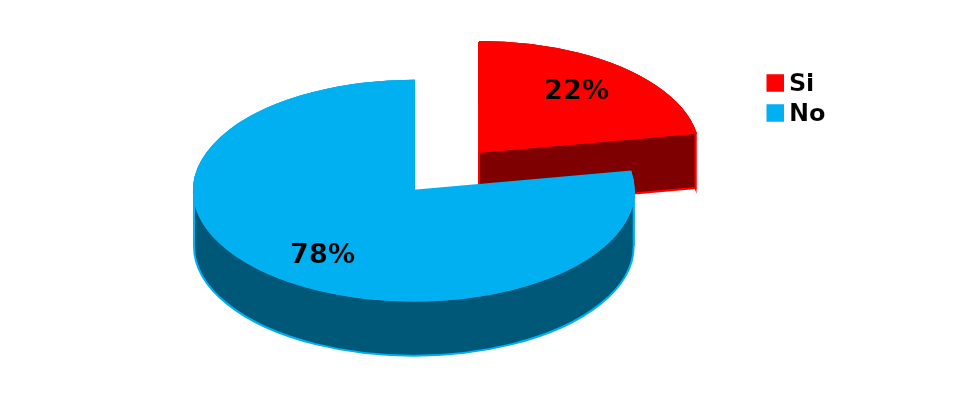
| Category | Series 0 |
|---|---|
| Si | 8 |
| No | 28 |